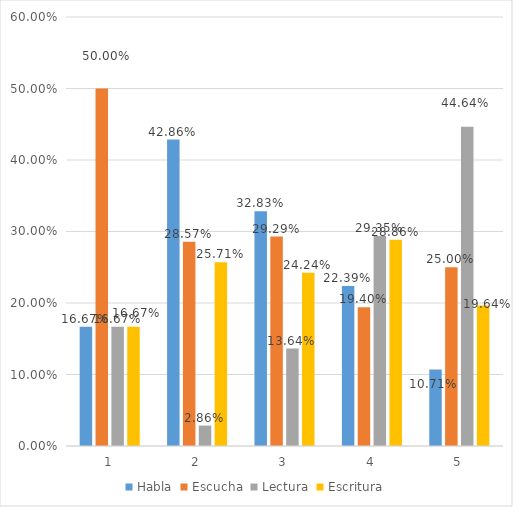
| Category | Habla | Escucha | Lectura | Escritura |
|---|---|---|---|---|
| 0 | 0.167 | 0.5 | 0.167 | 0.167 |
| 1 | 0.429 | 0.286 | 0.029 | 0.257 |
| 2 | 0.328 | 0.293 | 0.136 | 0.242 |
| 3 | 0.224 | 0.194 | 0.294 | 0.289 |
| 4 | 0.107 | 0.25 | 0.446 | 0.196 |